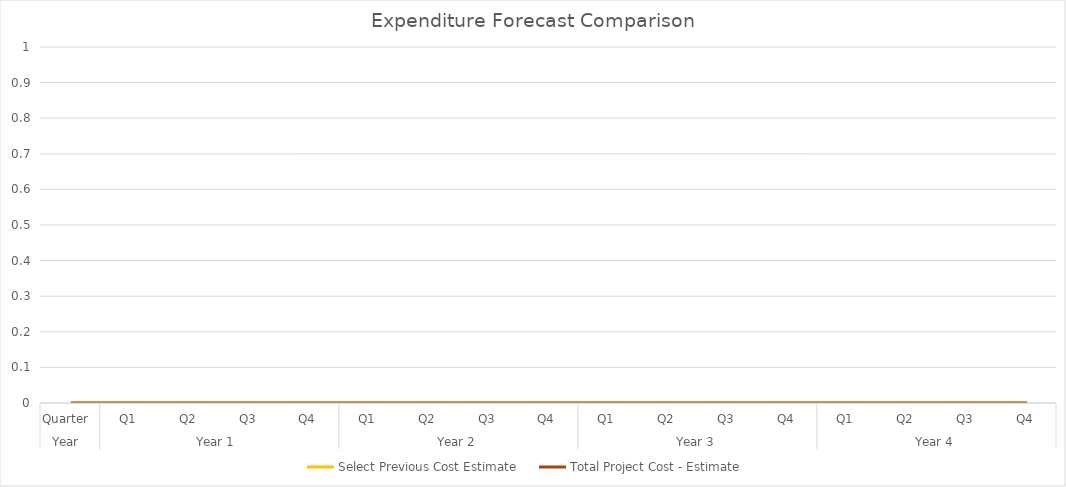
| Category | Select Previous Cost Estimate | Total Project Cost - Estimate |
|---|---|---|
| 0 | 0 | 0 |
| 1 | 0 | 0 |
| 2 | 0 | 0 |
| 3 | 0 | 0 |
| 4 | 0 | 0 |
| 5 | 0 | 0 |
| 6 | 0 | 0 |
| 7 | 0 | 0 |
| 8 | 0 | 0 |
| 9 | 0 | 0 |
| 10 | 0 | 0 |
| 11 | 0 | 0 |
| 12 | 0 | 0 |
| 13 | 0 | 0 |
| 14 | 0 | 0 |
| 15 | 0 | 0 |
| 16 | 0 | 0 |